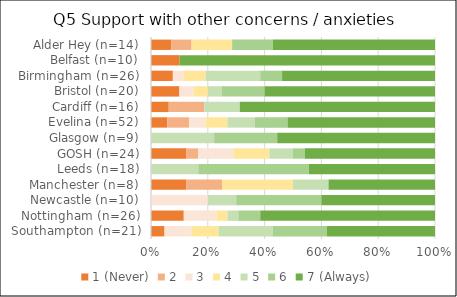
| Category | 1 (Never) | 2 | 3 | 4 | 5 | 6 | 7 (Always) |
|---|---|---|---|---|---|---|---|
| Southampton (n=21) | 1 | 0 | 2 | 2 | 4 | 4 | 8 |
| Nottingham (n=26) | 3 | 0 | 3 | 1 | 1 | 2 | 16 |
| Newcastle (n=10) | 0 | 0 | 2 | 0 | 1 | 3 | 4 |
| Manchester (n=8) | 1 | 1 | 0 | 2 | 1 | 0 | 3 |
| Leeds (n=18) | 0 | 0 | 0 | 0 | 3 | 7 | 8 |
| GOSH (n=24) | 3 | 1 | 3 | 3 | 2 | 1 | 11 |
| Glasgow (n=9) | 0 | 0 | 0 | 0 | 2 | 2 | 5 |
| Evelina (n=52) | 3 | 4 | 3 | 4 | 5 | 6 | 27 |
| Cardiff (n=16) | 1 | 2 | 0 | 0 | 2 | 0 | 11 |
| Bristol (n=20) | 2 | 0 | 1 | 1 | 1 | 3 | 12 |
| Birmingham (n=26) | 2 | 0 | 1 | 2 | 5 | 2 | 14 |
| Belfast (n=10) | 1 | 0 | 0 | 0 | 0 | 0 | 9 |
| Alder Hey (n=14) | 1 | 1 | 0 | 2 | 0 | 2 | 8 |